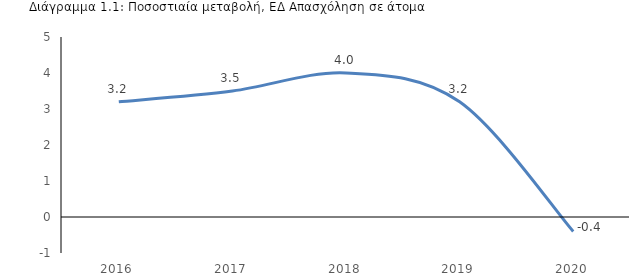
| Category | Απασχόληση, ΕΔ (άτομα, Στατιστική Υπηρεσία) % |
|---|---|
| 2016.0 | 3.2 |
| 2017.0 | 3.5 |
| 2018.0 | 4 |
| 2019.0 | 3.2 |
| 2020.0 | -0.4 |